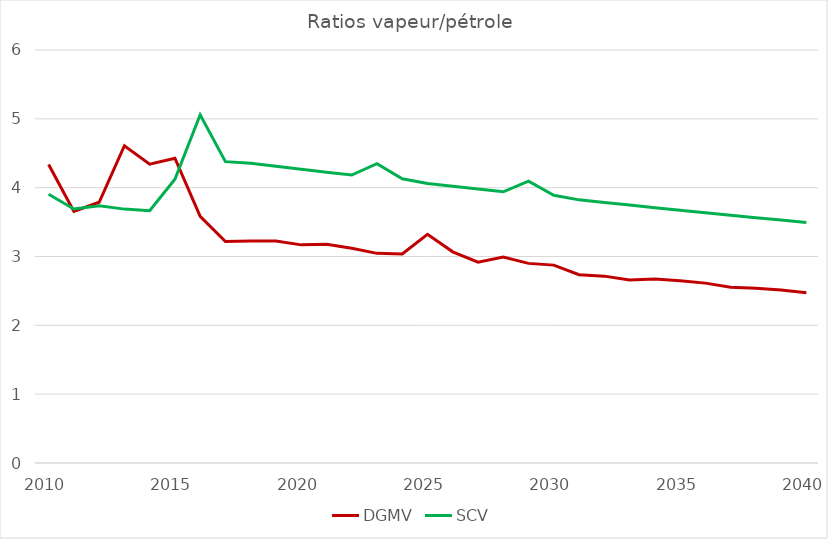
| Category | DGMV | SCV |
|---|---|---|
| 2010.0 | 4.336 | 3.903 |
| 2011.0 | 3.656 | 3.69 |
| 2012.0 | 3.788 | 3.739 |
| 2013.0 | 4.609 | 3.688 |
| 2014.0 | 4.342 | 3.664 |
| 2015.0 | 4.428 | 4.122 |
| 2016.0 | 3.584 | 5.059 |
| 2017.0 | 3.218 | 4.378 |
| 2018.0 | 3.225 | 4.354 |
| 2019.0 | 3.224 | 4.311 |
| 2020.0 | 3.169 | 4.268 |
| 2021.0 | 3.178 | 4.225 |
| 2022.0 | 3.119 | 4.183 |
| 2023.0 | 3.046 | 4.349 |
| 2024.0 | 3.037 | 4.13 |
| 2025.0 | 3.323 | 4.059 |
| 2026.0 | 3.068 | 4.019 |
| 2027.0 | 2.918 | 3.979 |
| 2028.0 | 2.993 | 3.939 |
| 2029.0 | 2.9 | 4.095 |
| 2030.0 | 2.875 | 3.889 |
| 2031.0 | 2.735 | 3.823 |
| 2032.0 | 2.715 | 3.785 |
| 2033.0 | 2.657 | 3.747 |
| 2034.0 | 2.673 | 3.71 |
| 2035.0 | 2.648 | 3.673 |
| 2036.0 | 2.613 | 3.636 |
| 2037.0 | 2.553 | 3.6 |
| 2038.0 | 2.54 | 3.564 |
| 2039.0 | 2.513 | 3.529 |
| 2040.0 | 2.473 | 3.494 |